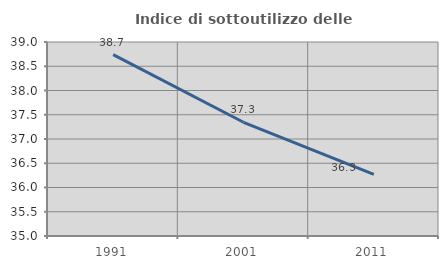
| Category | Indice di sottoutilizzo delle abitazioni  |
|---|---|
| 1991.0 | 38.741 |
| 2001.0 | 37.345 |
| 2011.0 | 36.269 |